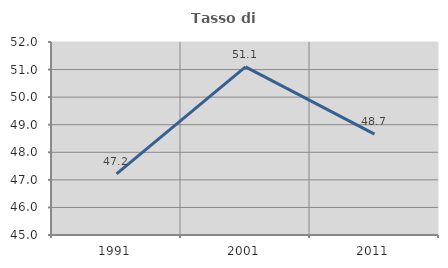
| Category | Tasso di occupazione   |
|---|---|
| 1991.0 | 47.218 |
| 2001.0 | 51.095 |
| 2011.0 | 48.66 |